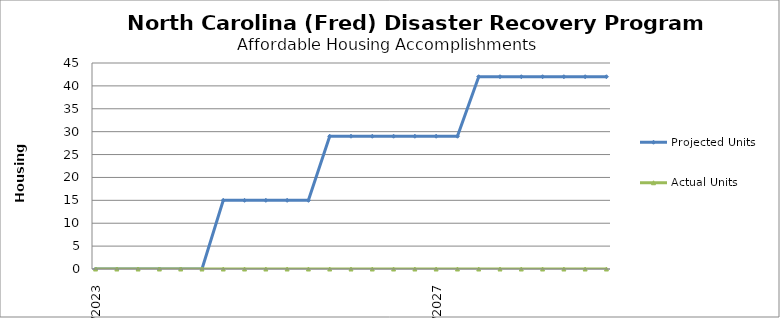
| Category | Projected Units | Actual Units |
|---|---|---|
| 4/1/23 | 0 | 0 |
| 7/1/23 | 0 | 0 |
| 10/1/23 | 0 | 0 |
| 1/1/24 | 0 | 0 |
| 4/1/24 | 0 | 0 |
| 7/1/24 | 0 | 0 |
| 10/1/24 | 15 | 0 |
| 1/1/25 | 15 | 0 |
| 4/1/25 | 15 | 0 |
| 7/1/25 | 15 | 0 |
| 10/1/25 | 15 | 0 |
| 1/1/26 | 29 | 0 |
| 4/1/26 | 29 | 0 |
| 7/1/26 | 29 | 0 |
| 10/1/26 | 29 | 0 |
| 1/1/27 | 29 | 0 |
| 4/1/27 | 29 | 0 |
| 7/1/27 | 29 | 0 |
| 10/1/27 | 42 | 0 |
| 1/1/28 | 42 | 0 |
| 4/1/28 | 42 | 0 |
| 7/1/28 | 42 | 0 |
| 10/1/28 | 42 | 0 |
| 1/1/29 | 42 | 0 |
| 4/1/29 | 42 | 0 |